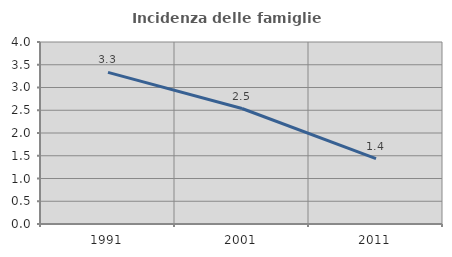
| Category | Incidenza delle famiglie numerose |
|---|---|
| 1991.0 | 3.333 |
| 2001.0 | 2.538 |
| 2011.0 | 1.435 |